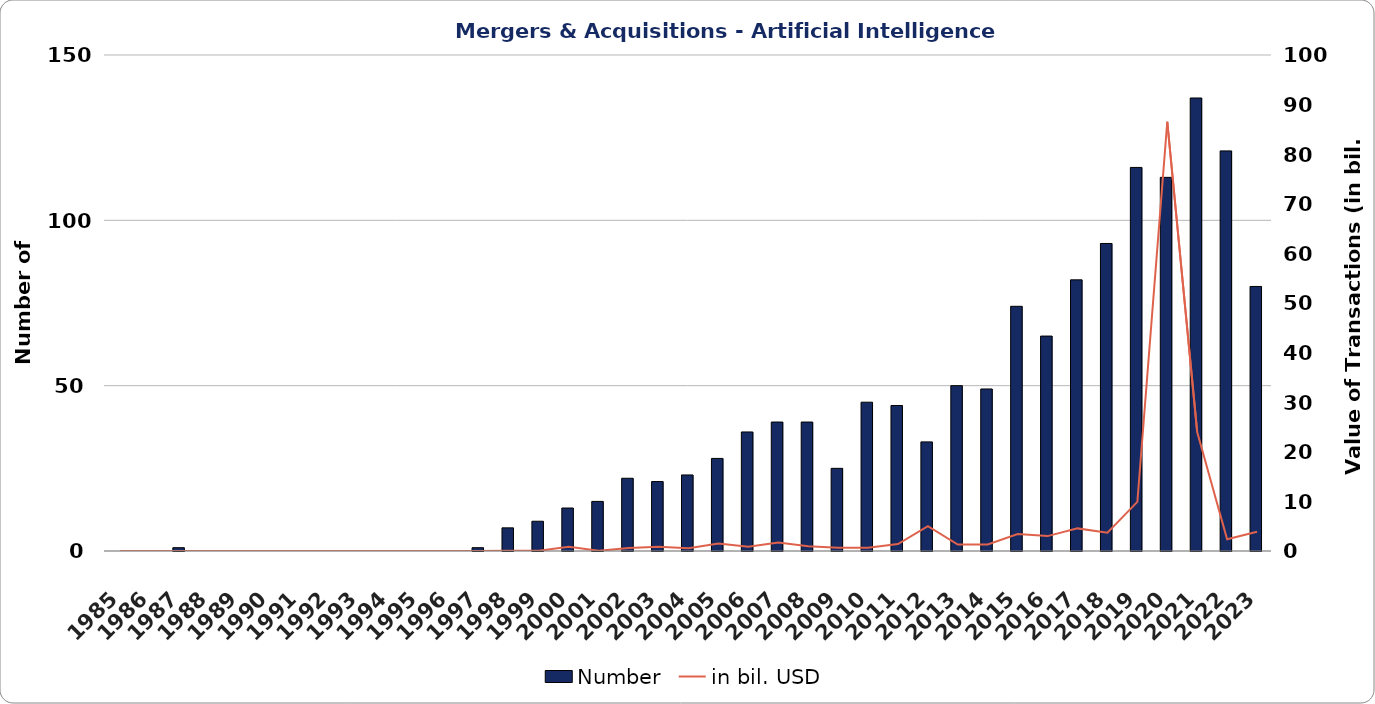
| Category | Number |
|---|---|
| 1985 | 0 |
| 1986 | 0 |
| 1987 | 1 |
| 1988 | 0 |
| 1989 | 0 |
| 1990 | 0 |
| 1991 | 0 |
| 1992 | 0 |
| 1993 | 0 |
| 1994 | 0 |
| 1995 | 0 |
| 1996 | 0 |
| 1997 | 1 |
| 1998 | 7 |
| 1999 | 9 |
| 2000 | 13 |
| 2001 | 15 |
| 2002 | 22 |
| 2003 | 21 |
| 2004 | 23 |
| 2005 | 28 |
| 2006 | 36 |
| 2007 | 39 |
| 2008 | 39 |
| 2009 | 25 |
| 2010 | 45 |
| 2011 | 44 |
| 2012 | 33 |
| 2013 | 50 |
| 2014 | 49 |
| 2015 | 74 |
| 2016 | 65 |
| 2017 | 82 |
| 2018 | 93 |
| 2019 | 116 |
| 2020 | 113 |
| 2021 | 137 |
| 2022 | 121 |
| 2023 | 80 |